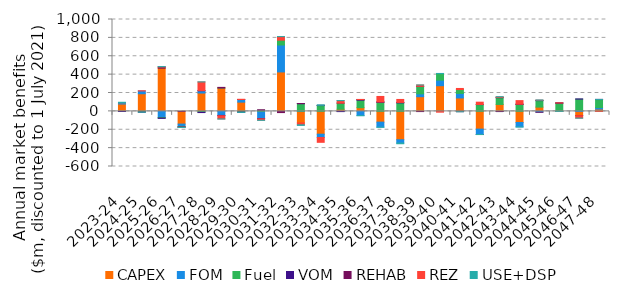
| Category | CAPEX | FOM | Fuel | VOM | REHAB | REZ | USE+DSP |
|---|---|---|---|---|---|---|---|
| 2023-24 | 80.208 | 12.827 | -0.531 | -0.218 | 0 | 0.001 | 6.062 |
| 2024-25 | 191.833 | 30.334 | -6.697 | -1.114 | 0 | 2.024 | -0.002 |
| 2025-26 | 470.546 | -66.543 | -6.084 | -3.404 | 12.135 | 2.763 | 2.258 |
| 2026-27 | -138.42 | -25.051 | -5.913 | -2.342 | 0.192 | -2.558 | -1.508 |
| 2027-28 | 199.699 | 24.91 | -9.704 | -3.221 | 1.051 | 94.948 | 0.07 |
| 2028-29 | 254.272 | -43.976 | 0.303 | -3.313 | 6.549 | -34.957 | -0.952 |
| 2029-30 | 100.754 | 28.2 | -6.928 | -3.433 | 0.578 | 2.09 | -0.641 |
| 2030-31 | 1.445 | -77.959 | 10.091 | -2.892 | 6.011 | -15.387 | -1.048 |
| 2031-32 | 429.417 | 293.052 | 52.235 | -1.907 | -11.192 | 38.797 | 0.454 |
| 2032-33 | -125.255 | 2.223 | 81.875 | 0.26 | 0.658 | -20.98 | -6.534 |
| 2033-34 | -248.387 | -35.629 | 63.424 | 1.881 | 0.001 | -52.871 | 5.716 |
| 2034-35 | 23.095 | -1.237 | 66.965 | -1.172 | 0 | 26.684 | 0.954 |
| 2035-36 | 40.122 | -45.737 | 81.714 | 5.446 | 1.216 | 1.543 | -1.24 |
| 2036-37 | -117.29 | -54.43 | 99.262 | 1.784 | 1.824 | 59.551 | -1.174 |
| 2037-38 | -308.763 | -35.985 | 92.261 | 5.36 | 0 | 32.192 | -7.578 |
| 2038-39 | 159.715 | 30.918 | 80.244 | 1.083 | -2.11 | 15.027 | 0.015 |
| 2039-40 | 279.45 | 60.61 | 70.927 | -1.481 | 0 | -7.157 | 1.794 |
| 2040-41 | 146.079 | 49.252 | 41.877 | -1.871 | -0.815 | 12.185 | -1.495 |
| 2041-42 | -193.298 | -58.305 | 73.98 | 0.576 | 0 | 25.507 | -0.772 |
| 2042-43 | 75.383 | -1.854 | 73.597 | 1.891 | 0 | 6.95 | 2.071 |
| 2043-44 | -121.05 | -47.684 | 75.824 | 1.828 | 0 | 39.634 | -1.491 |
| 2044-45 | 46.373 | -9.206 | 70.785 | 2.06 | 0 | 2.899 | 1.664 |
| 2045-46 | -0.456 | 0.188 | 89.951 | 1.019 | 0 | 1.478 | -0.171 |
| 2046-47 | -47.058 | 11.032 | 122.254 | 2.129 | 0 | -26.011 | -0.347 |
| 2047-48 | 25.211 | 15.755 | 87.89 | 0.971 | 0 | -0.364 | 0.314 |